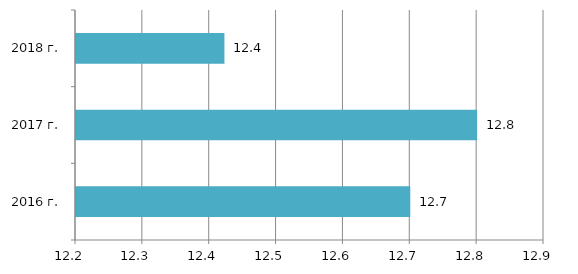
| Category | Series 0 |
|---|---|
| 2016 г. | 12.7 |
| 2017 г. | 12.8 |
| 2018 г. | 12.422 |